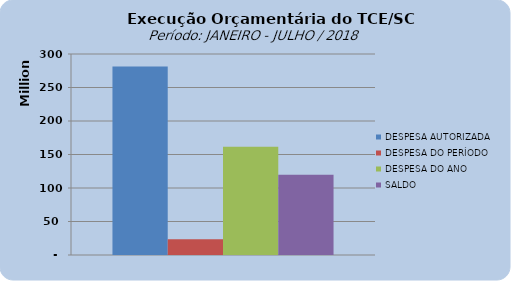
| Category | DESPESA AUTORIZADA | DESPESA DO PERÍODO | DESPESA DO ANO | SALDO |
|---|---|---|---|---|
| 0 | 281520024.63 | 23519101.14 | 161715358.26 | 119804666.37 |